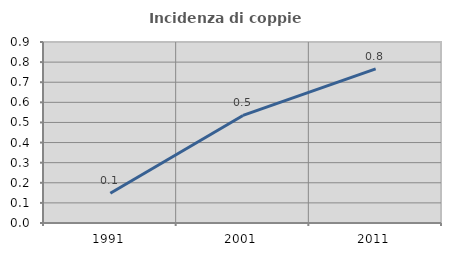
| Category | Incidenza di coppie miste |
|---|---|
| 1991.0 | 0.148 |
| 2001.0 | 0.535 |
| 2011.0 | 0.766 |